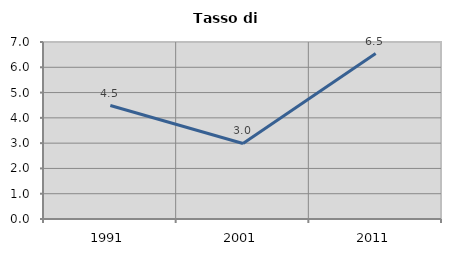
| Category | Tasso di disoccupazione   |
|---|---|
| 1991.0 | 4.487 |
| 2001.0 | 2.987 |
| 2011.0 | 6.544 |